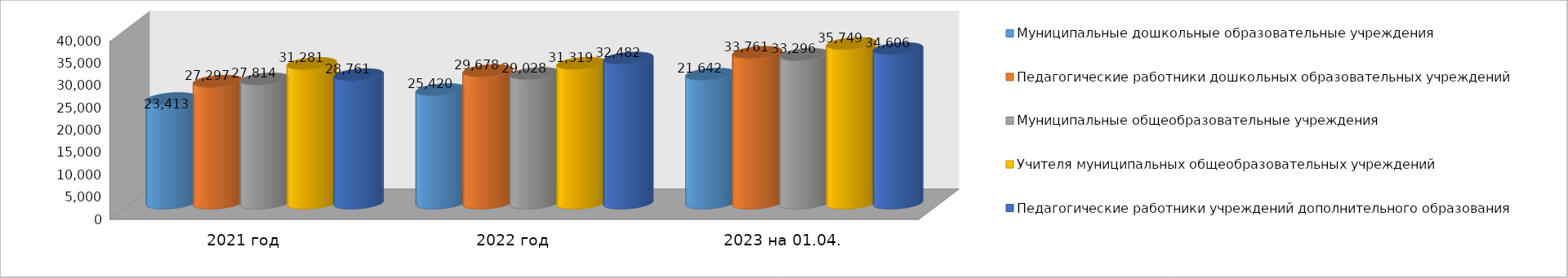
| Category | Муниципальные дошкольные образовательные учреждения | Педагогические работники дошкольных образовательных учреждений | Муниципальные общеобразовательные учреждения | Учителя муниципальных общеобразовательных учреждений | Педагогические работники учреждений дополнительного образования |
|---|---|---|---|---|---|
| 2021 год | 23413 | 27297 | 27814 | 31281 | 28761 |
| 2022 год | 25420 | 29678 | 29028 | 31319 | 32482 |
| 2023 на 01.04. | 28883 | 33761 | 33296 | 35749 | 34606 |